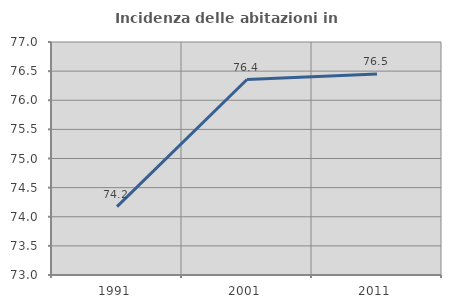
| Category | Incidenza delle abitazioni in proprietà  |
|---|---|
| 1991.0 | 74.174 |
| 2001.0 | 76.355 |
| 2011.0 | 76.451 |